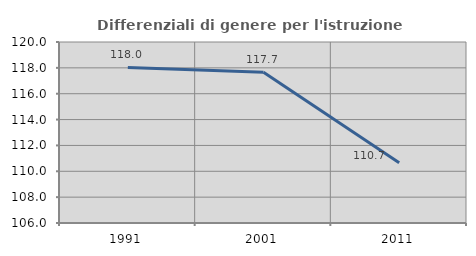
| Category | Differenziali di genere per l'istruzione superiore |
|---|---|
| 1991.0 | 118.037 |
| 2001.0 | 117.656 |
| 2011.0 | 110.663 |